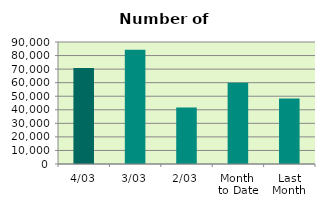
| Category | Series 0 |
|---|---|
| 4/03 | 70806 |
| 3/03 | 84198 |
| 2/03 | 41610 |
| Month 
to Date | 59877.5 |
| Last
Month | 48363.3 |